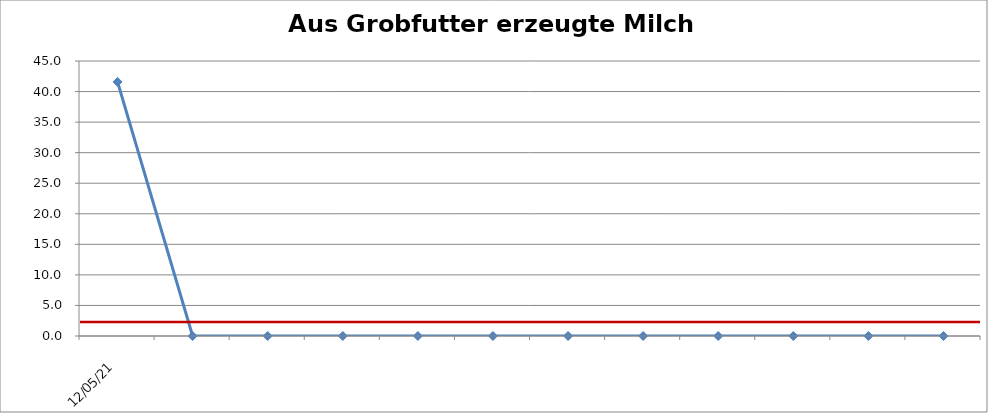
| Category | Aus Grobfutter erzeugte Milch (%) |
|---|---|
| 12.05.21 | 41.579 |
|    | 0 |
|    | 0 |
|    | 0 |
|    | 0 |
|    | 0 |
|    | 0 |
|    | 0 |
|    | 0 |
|    | 0 |
|    | 0 |
|    | 0 |